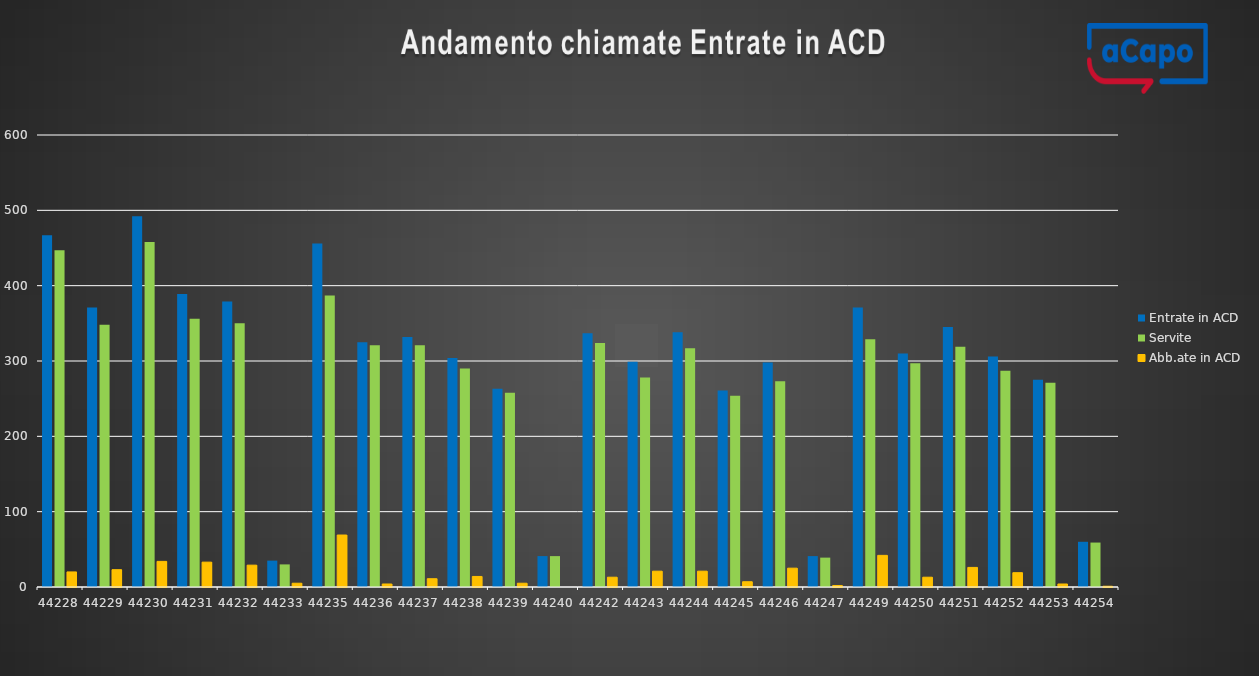
| Category | Entrate in ACD | Servite | Abb.ate in ACD |
|---|---|---|---|
| 2/1/21 | 467 | 447 | 20 |
| 2/2/21 | 371 | 348 | 23 |
| 2/3/21 | 492 | 458 | 34 |
| 2/4/21 | 389 | 356 | 33 |
| 2/5/21 | 379 | 350 | 29 |
| 2/6/21 | 35 | 30 | 5 |
| 2/8/21 | 456 | 387 | 69 |
| 2/9/21 | 325 | 321 | 4 |
| 2/10/21 | 332 | 321 | 11 |
| 2/11/21 | 304 | 290 | 14 |
| 2/12/21 | 263 | 258 | 5 |
| 2/13/21 | 41 | 41 | 0 |
| 2/15/21 | 337 | 324 | 13 |
| 2/16/21 | 299 | 278 | 21 |
| 2/17/21 | 338 | 317 | 21 |
| 2/18/21 | 261 | 254 | 7 |
| 2/19/21 | 298 | 273 | 25 |
| 2/20/21 | 41 | 39 | 2 |
| 2/22/21 | 371 | 329 | 42 |
| 2/23/21 | 310 | 297 | 13 |
| 2/24/21 | 345 | 319 | 26 |
| 2/25/21 | 306 | 287 | 19 |
| 2/26/21 | 275 | 271 | 4 |
| 2/27/21 | 60 | 59 | 1 |